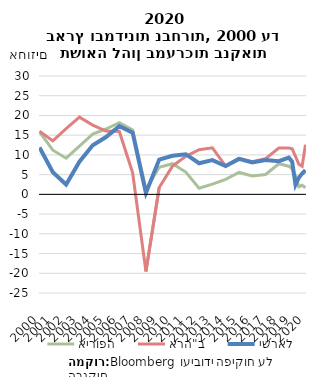
| Category | אירופה | ארה"ב | ישראל |
|---|---|---|---|
| 2000-12-01 | 15.82 | 15.99 | 11.888 |
| 2001-12-01 | 11.2 | 13.55 | 5.6 |
| 2002-12-01 | 9.16 | 16.66 | 2.477 |
| 2003-12-01 | 12.23 | 19.57 | 8.272 |
| 2004-12-01 | 15.29 | 17.56 | 12.433 |
| 2005-12-01 | 16.57 | 16.06 | 14.531 |
| 2006-12-01 | 18.17 | 15.93 | 17.273 |
| 2007-12-01 | 16.33 | 5.49 | 15.632 |
| 2008-12-01 | 1.25 | -19.53 | 0.347 |
| 2009-12-01 | 6.89 | 1.72 | 8.805 |
| 2010-12-01 | 7.77 | 7.15 | 9.793 |
| 2011-12-01 | 5.66 | 9.64 | 10.175 |
| 2012-12-01 | 1.55 | 11.32 | 7.883 |
| 2013-12-01 | 2.61 | 11.79 | 8.684 |
| 2014-12-01 | 3.78 | 7.18 | 7.165 |
| 2015-12-01 | 5.56 | 9.15 | 8.992 |
| 2016-12-01 | 4.68 | 8.28 | 8.065 |
| 2017-12-01 | 5.03 | 9.06 | 8.707 |
| 2018-12-01 | 7.76 | 11.76 | 8.392 |
| 2019-09-01 | 7.14 | 11.75 | 9.299 |
| 2019-12-01 | 6.45 | 11.53 | 8.299 |
| 2020-03-01 | 4.74 | 9.63 | 2.432 |
| 2020-06-01 | 1.93 | 7.66 | 4.2 |
| 2020-09-01 | 2.29 | 7.13 | 5.258 |
| 2020-12-01 | 1.7 | 12.61 | 6.14 |